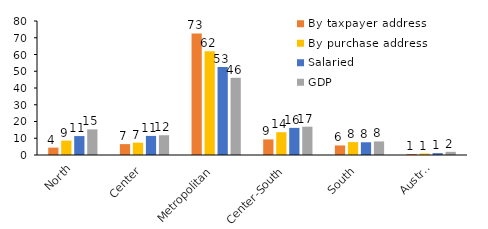
| Category | By taxpayer address | By purchase address | Salaried | GDP |
|---|---|---|---|---|
| North | 4.4 | 8.586 | 11.3 | 15.3 |
| Center | 6.5 | 7.377 | 11.4 | 11.8 |
| Metropolitan | 72.6 | 61.895 | 52.5 | 46.1 |
| Center-South | 9.3 | 13.591 | 16.2 | 16.9 |
| South | 5.7 | 7.684 | 7.6 | 8.1 |
| Austral | 0.6 | 0.866 | 1.1 | 1.9 |